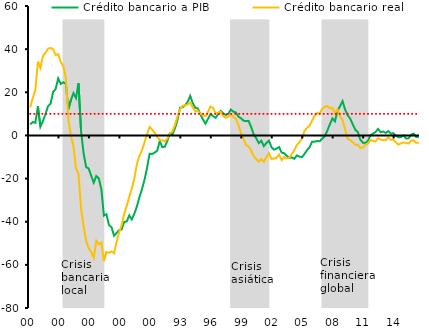
| Category | Períodos de fragilidad |
|---|---|
| 78 | 0 |
| II | 0 |
| III | 0 |
| IV | 0 |
| 79 | 0 |
| II | 0 |
| III | 0 |
| IV | 0 |
| 80 | 0 |
| II | 0 |
| III | 0 |
| IV | 0 |
| 81 | 0 |
| II | 0 |
| III | 1 |
| IV | 1 |
| 82 | 1 |
| II | 1 |
| III | 1 |
| IV | 1 |
| 83 | 1 |
| II | 1 |
| III | 1 |
| IV | 1 |
| 84 | 1 |
| II | 1 |
| III | 1 |
| IV | 1 |
| 85 | 1 |
| II | 1 |
| III | 0 |
| IV | 0 |
| 86 | 0 |
| II | 0 |
| III | 0 |
| IV | 0 |
| 87 | 0 |
| II | 0 |
| III | 0 |
| IV | 0 |
| 88 | 0 |
| II | 0 |
| III | 0 |
| IV | 0 |
| 89 | 0 |
| II | 0 |
| III | 0 |
| IV | 0 |
| 90 | 0 |
| II | 0 |
| III | 0 |
| IV | 0 |
| 91 | 0 |
| II | 0 |
| III | 0 |
| IV | 0 |
| 92 | 0 |
| II | 0 |
| III | 0 |
| IV | 0 |
| 93 | 0 |
| II | 0 |
| III | 0 |
| IV | 0 |
| 94 | 0 |
| II | 0 |
| III | 0 |
| IV | 0 |
| 95 | 0 |
| II | 0 |
| III | 0 |
| IV | 0 |
| 96 | 0 |
| II | 0 |
| III | 0 |
| IV | 0 |
| 97 | 0 |
| II | 0 |
| III | 0 |
| IV | 0 |
| 98 | 1 |
| II | 1 |
| III | 1 |
| IV | 1 |
| 99 | 1 |
| II | 1 |
| III | 1 |
| IV | 1 |
| 00 | 1 |
| II | 1 |
| III | 1 |
| IV | 1 |
| 01 | 1 |
| II | 1 |
| III | 1 |
| IV | 0 |
| 02 | 0 |
| II | 0 |
| III | 0 |
| IV | 0 |
| 03 | 0 |
| II | 0 |
| III | 0 |
| IV | 0 |
| 04 | 0 |
| II | 0 |
| III | 0 |
| IV | 0 |
| 05 | 0 |
| II | 0 |
| III | 0 |
| IV | 0 |
| 06 | 0 |
| II | 0 |
| III | 0 |
| IV | 0 |
| 07 | 1 |
| II | 1 |
| III | 1 |
| IV | 1 |
| 08 | 1 |
| II | 1 |
| III | 1 |
| IV | 1 |
| 09 | 1 |
| II | 1 |
| III | 1 |
| IV | 1 |
| 10 | 1 |
| II | 1 |
| III | 1 |
| IV | 1 |
| 11 | 1 |
| II | 1 |
| III | 0 |
| IV | 0 |
| 12 | 0 |
| II | 0 |
| III | 0 |
| IV | 0 |
| 13 | 0 |
| II | 0 |
| III | 0 |
| IV | 0 |
| 14 | 0 |
| II | 0 |
| III | 0 |
| IV | 0 |
| 15 | 0 |
| II | 0 |
| III | 0 |
| IV | 0 |
| 16 | 0 |
| II | 0 |